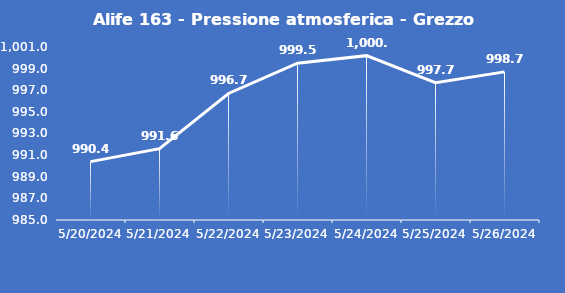
| Category | Alife 163 - Pressione atmosferica - Grezzo (hPa) |
|---|---|
| 5/20/24 | 990.4 |
| 5/21/24 | 991.6 |
| 5/22/24 | 996.7 |
| 5/23/24 | 999.5 |
| 5/24/24 | 1000.2 |
| 5/25/24 | 997.7 |
| 5/26/24 | 998.7 |